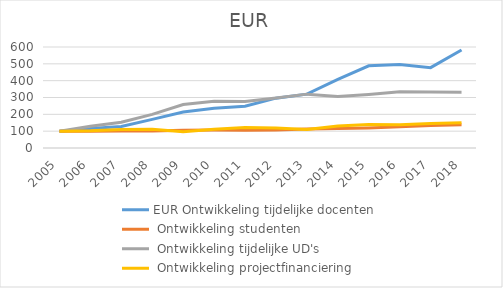
| Category | EUR Ontwikkeling tijdelijke docenten | EUR Ontwikkeling studenten | EUR Ontwikkeling tijdelijke UD's | EUR Ontwikkeling projectfinanciering |
|---|---|---|---|---|
| 2005.0 | 100 | 100 | 100 | 100 |
| 2006.0 | 116 | 99.784 | 129.091 | 102.5 |
| 2007.0 | 128 | 100.293 | 152.727 | 110 |
| 2008.0 | 170 | 100.714 | 200 | 110.703 |
| 2009.0 | 214 | 105.287 | 258.182 | 96.875 |
| 2010.0 | 236 | 106.546 | 278.182 | 110.781 |
| 2011.0 | 248 | 105.457 | 276.364 | 122.5 |
| 2012.0 | 296 | 107.465 | 296.364 | 119.453 |
| 2013.0 | 320 | 113.42 | 320 | 109.453 |
| 2014.0 | 408 | 115.424 | 305.455 | 130.547 |
| 2015.0 | 488 | 119.344 | 318.182 | 138.906 |
| 2016.0 | 496 | 125.628 | 334.545 | 138.281 |
| 2017.0 | 477.16 | 133.124 | 332.545 | 146.016 |
| 2018.0 | 581.88 | 138.53 | 331.473 | 149.688 |